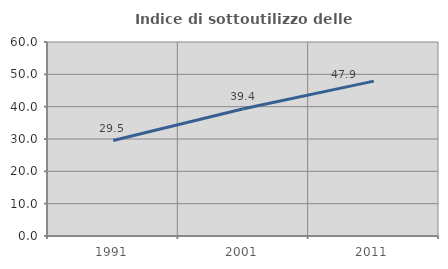
| Category | Indice di sottoutilizzo delle abitazioni  |
|---|---|
| 1991.0 | 29.534 |
| 2001.0 | 39.352 |
| 2011.0 | 47.899 |